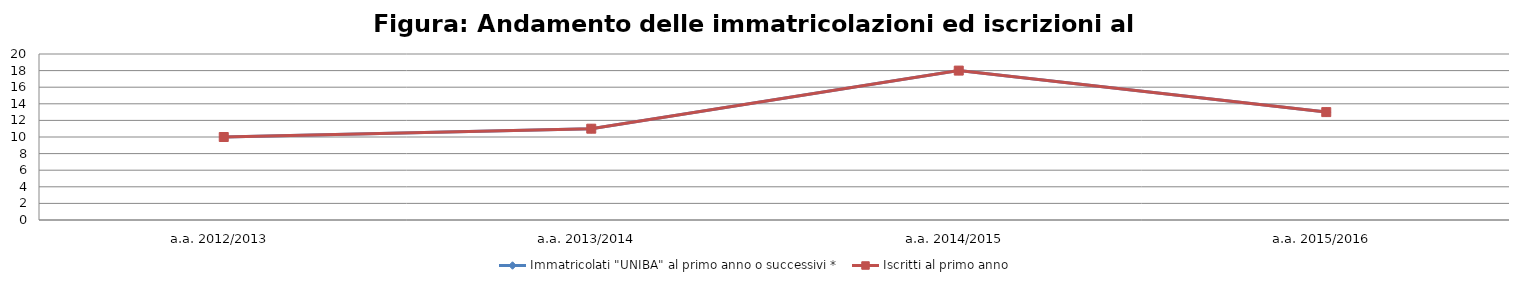
| Category | Immatricolati "UNIBA" al primo anno o successivi * | Iscritti al primo anno  |
|---|---|---|
| a.a. 2012/2013 | 10 | 10 |
| a.a. 2013/2014 | 11 | 11 |
| a.a. 2014/2015 | 18 | 18 |
| a.a. 2015/2016 | 13 | 13 |